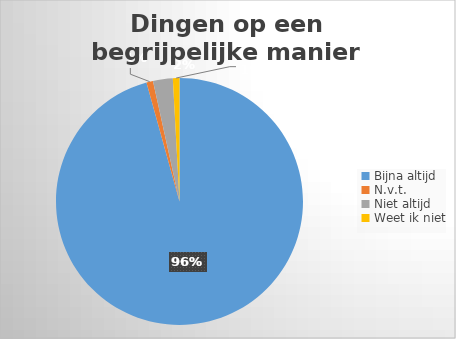
| Category | Aantal  |
|---|---|
| Bijna altijd | 111 |
| N.v.t. | 1 |
| Niet altijd | 3 |
| Weet ik niet | 1 |